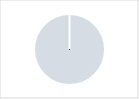
| Category | Minimal level of satisfaction (all criteria scored 0) |
|---|---|
| 0 | 1 |